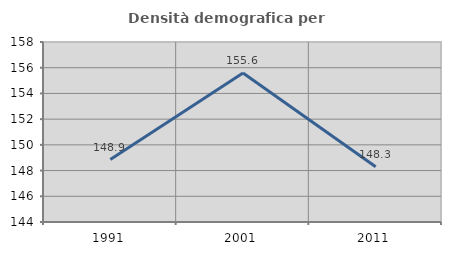
| Category | Densità demografica |
|---|---|
| 1991.0 | 148.859 |
| 2001.0 | 155.587 |
| 2011.0 | 148.29 |